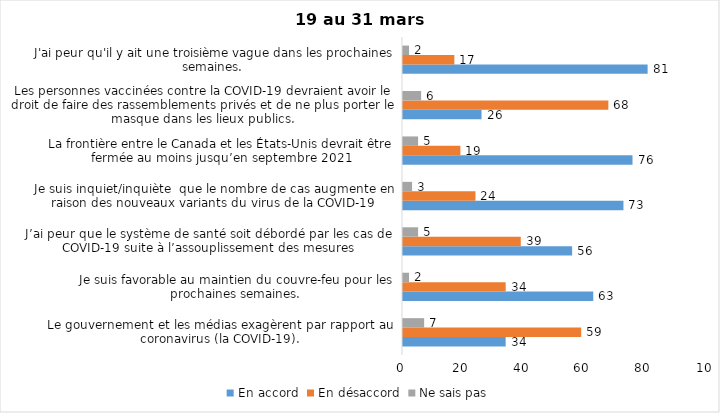
| Category | En accord | En désaccord | Ne sais pas |
|---|---|---|---|
| Le gouvernement et les médias exagèrent par rapport au coronavirus (la COVID-19). | 34 | 59 | 7 |
| Je suis favorable au maintien du couvre-feu pour les prochaines semaines. | 63 | 34 | 2 |
| J’ai peur que le système de santé soit débordé par les cas de COVID-19 suite à l’assouplissement des mesures | 56 | 39 | 5 |
| Je suis inquiet/inquiète  que le nombre de cas augmente en raison des nouveaux variants du virus de la COVID-19 | 73 | 24 | 3 |
| La frontière entre le Canada et les États-Unis devrait être fermée au moins jusqu’en septembre 2021 | 76 | 19 | 5 |
| Les personnes vaccinées contre la COVID-19 devraient avoir le droit de faire des rassemblements privés et de ne plus porter le masque dans les lieux publics. | 26 | 68 | 6 |
| J'ai peur qu'il y ait une troisième vague dans les prochaines semaines. | 81 | 17 | 2 |